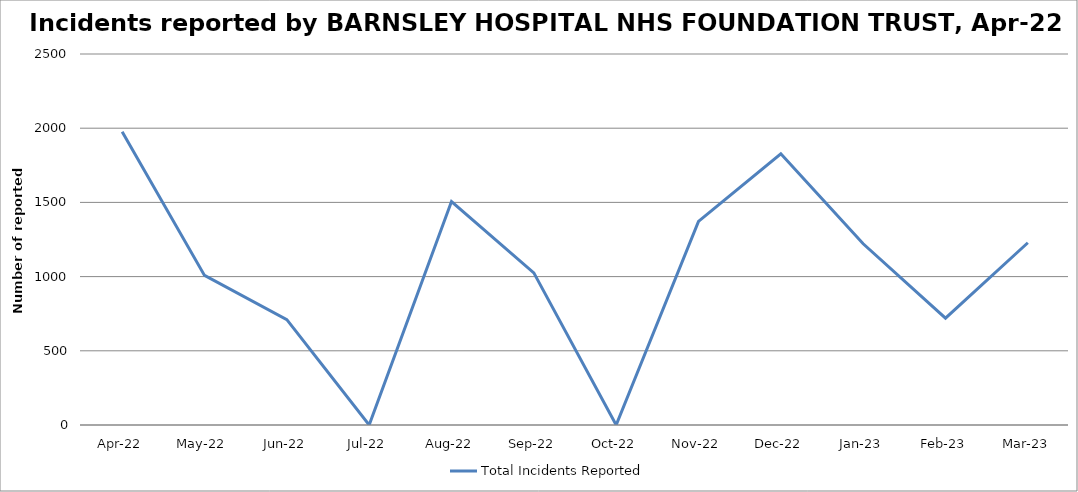
| Category | Total Incidents Reported |
|---|---|
| Apr-22 | 1976 |
| May-22 | 1008 |
| Jun-22 | 710 |
| Jul-22 | 0 |
| Aug-22 | 1506 |
| Sep-22 | 1025 |
| Oct-22 | 0 |
| Nov-22 | 1372 |
| Dec-22 | 1828 |
| Jan-23 | 1221 |
| Feb-23 | 720 |
| Mar-23 | 1228 |